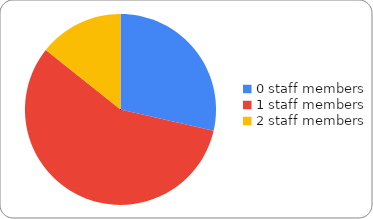
| Category | Series 0 |
|---|---|
| 0 staff members | 4 |
| 1 staff members | 8 |
| 2 staff members | 2 |